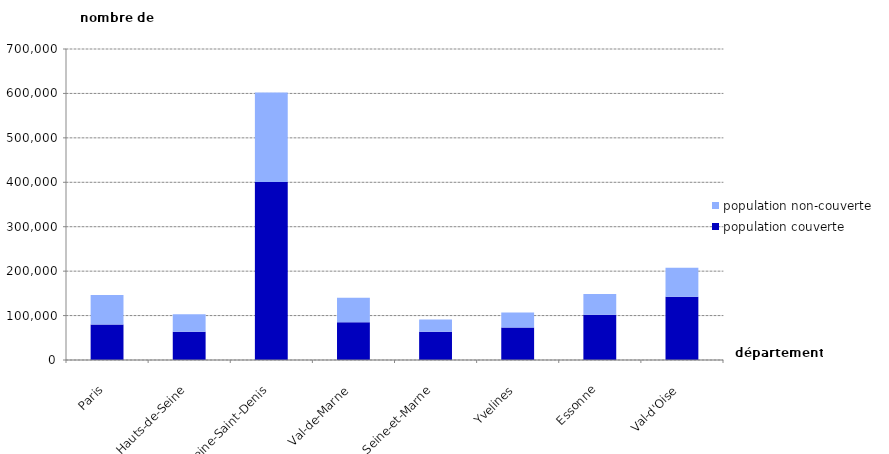
| Category | population couverte | population non-couverte |
|---|---|---|
| Paris | 80179 | 66138 |
| Hauts-de-Seine | 63559 | 39579 |
| Seine-Saint-Denis | 400628 | 201426 |
| Val-de-Marne | 85180 | 54726 |
| Seine-et-Marne | 63673 | 27389 |
| Yvelines | 73368 | 33617 |
| Essonne | 101790 | 47008 |
| Val-d'Oise | 142260 | 65511 |